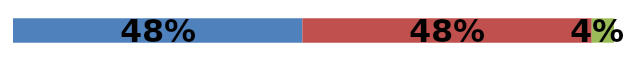
| Category | Series 0 | Series 1 | Series 2 |
|---|---|---|---|
| 0 | 0.481 | 0.481 | 0.037 |